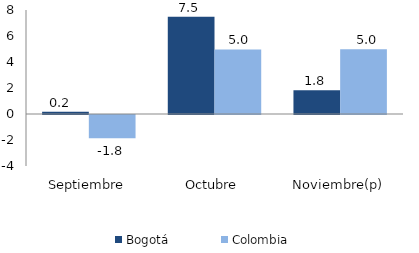
| Category | Bogotá | Colombia |
|---|---|---|
| Septiembre | 0.169 | -1.788 |
| Octubre | 7.481 | 4.969 |
| Noviembre(p) | 1.822 | 4.985 |